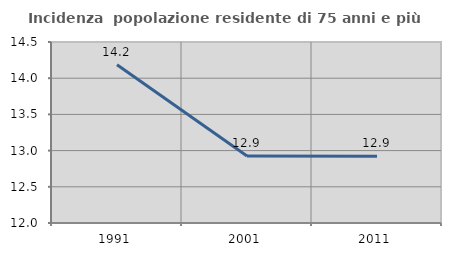
| Category | Incidenza  popolazione residente di 75 anni e più |
|---|---|
| 1991.0 | 14.184 |
| 2001.0 | 12.926 |
| 2011.0 | 12.921 |